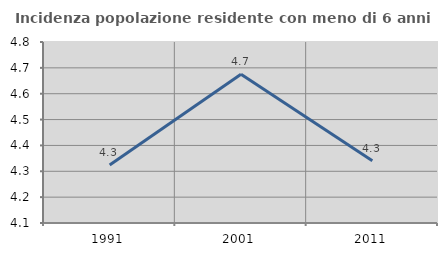
| Category | Incidenza popolazione residente con meno di 6 anni |
|---|---|
| 1991.0 | 4.324 |
| 2001.0 | 4.675 |
| 2011.0 | 4.341 |